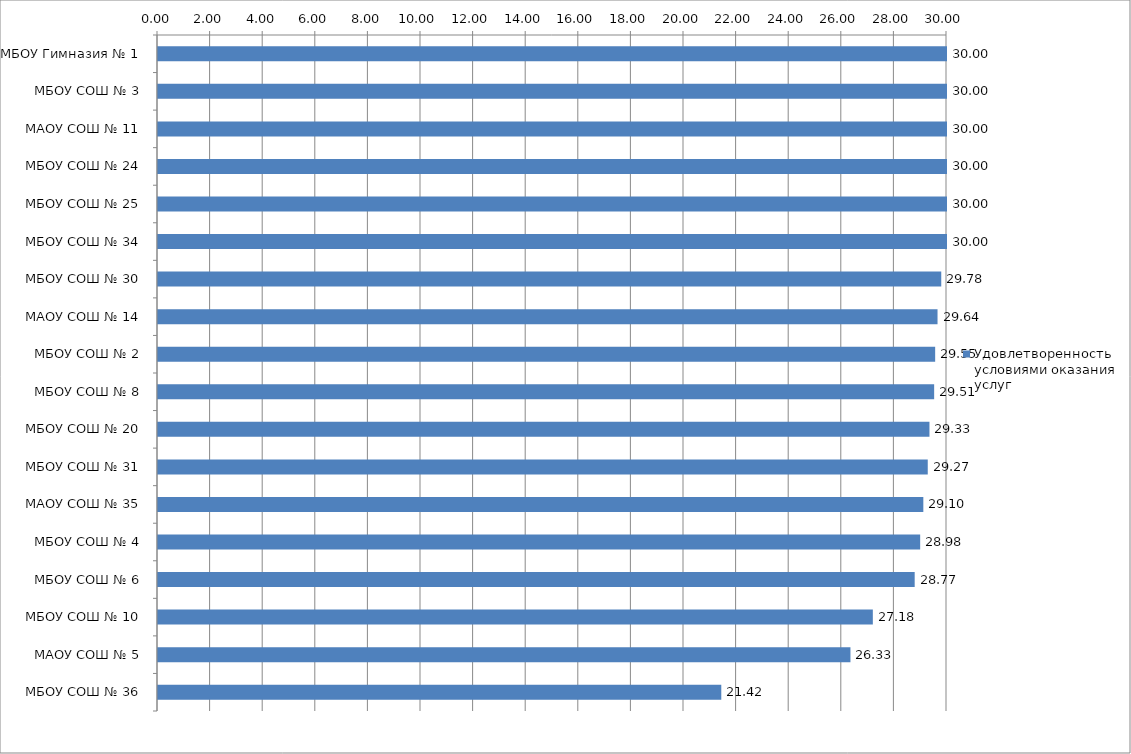
| Category | Удовлетворенность условиями оказания услуг |
|---|---|
| МБОУ Гимназия № 1 | 30 |
| МБОУ СОШ № 3 | 30 |
| МАОУ СОШ № 11 | 30 |
| МБОУ СОШ № 24 | 30 |
| МБОУ СОШ № 25 | 30 |
| МБОУ СОШ № 34 | 30 |
| МБОУ СОШ № 30 | 29.781 |
| МАОУ СОШ № 14 | 29.64 |
| МБОУ СОШ № 2 | 29.55 |
| МБОУ СОШ № 8 | 29.512 |
| МБОУ СОШ № 20 | 29.333 |
| МБОУ СОШ № 31 | 29.268 |
| МАОУ СОШ № 35 | 29.1 |
| МБОУ СОШ № 4 | 28.98 |
| МБОУ СОШ № 6 | 28.771 |
| МБОУ СОШ № 10 | 27.18 |
| МАОУ СОШ № 5 | 26.329 |
| МБОУ СОШ № 36 | 21.418 |